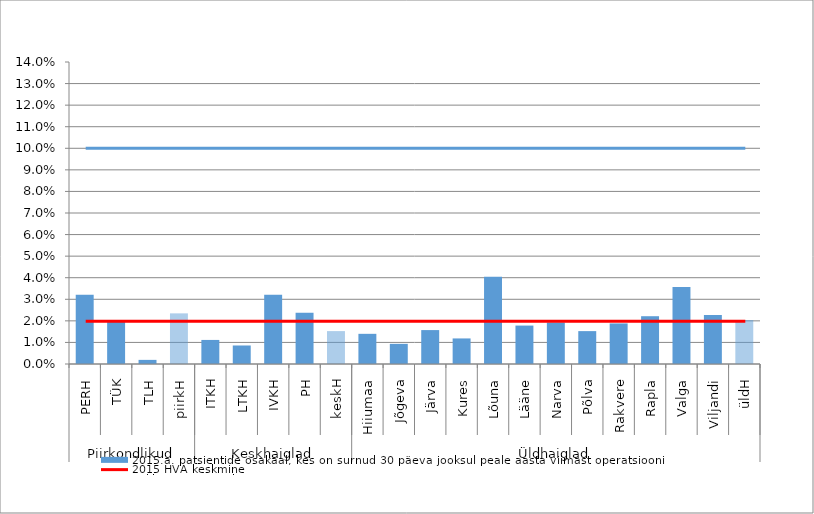
| Category | 2015.a. patsientide osakaal, kes on surnud 30 päeva jooksul peale aasta viimast operatsiooni |
|---|---|
| 0 | 0.032 |
| 1 | 0.02 |
| 2 | 0.002 |
| 3 | 0.023 |
| 4 | 0.011 |
| 5 | 0.009 |
| 6 | 0.032 |
| 7 | 0.024 |
| 8 | 0.015 |
| 9 | 0.014 |
| 10 | 0.009 |
| 11 | 0.016 |
| 12 | 0.012 |
| 13 | 0.04 |
| 14 | 0.018 |
| 15 | 0.019 |
| 16 | 0.015 |
| 17 | 0.019 |
| 18 | 0.022 |
| 19 | 0.036 |
| 20 | 0.023 |
| 21 | 0.02 |